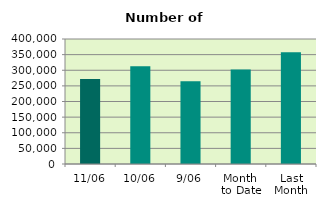
| Category | Series 0 |
|---|---|
| 11/06 | 272150 |
| 10/06 | 312432 |
| 9/06 | 264898 |
| Month 
to Date | 302531.778 |
| Last
Month | 357760.286 |